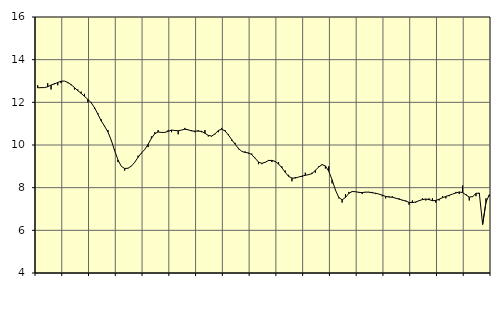
| Category | Piggar | Tillverkning av verkstadsvaror, SNI 25-30, 33 |
|---|---|---|
| nan | 12.8 | 12.68 |
| 87.0 | 12.7 | 12.69 |
| 87.0 | 12.7 | 12.69 |
| 87.0 | 12.9 | 12.73 |
| nan | 12.6 | 12.81 |
| 88.0 | 12.9 | 12.86 |
| 88.0 | 12.8 | 12.93 |
| 88.0 | 12.9 | 12.99 |
| nan | 13 | 13 |
| 89.0 | 12.9 | 12.93 |
| 89.0 | 12.8 | 12.83 |
| 89.0 | 12.6 | 12.69 |
| nan | 12.6 | 12.55 |
| 90.0 | 12.5 | 12.42 |
| 90.0 | 12.4 | 12.28 |
| 90.0 | 12 | 12.14 |
| nan | 12 | 11.98 |
| 91.0 | 11.7 | 11.75 |
| 91.0 | 11.5 | 11.44 |
| 91.0 | 11.2 | 11.13 |
| nan | 10.9 | 10.88 |
| 92.0 | 10.7 | 10.61 |
| 92.0 | 10.2 | 10.22 |
| 92.0 | 9.8 | 9.74 |
| nan | 9.2 | 9.3 |
| 93.0 | 9 | 9 |
| 93.0 | 8.8 | 8.9 |
| 93.0 | 8.9 | 8.91 |
| nan | 9 | 9.01 |
| 94.0 | 9.2 | 9.19 |
| 94.0 | 9.5 | 9.42 |
| 94.0 | 9.6 | 9.62 |
| nan | 9.8 | 9.79 |
| 95.0 | 9.9 | 10.03 |
| 95.0 | 10.4 | 10.31 |
| 95.0 | 10.6 | 10.53 |
| nan | 10.7 | 10.61 |
| 96.0 | 10.6 | 10.59 |
| 96.0 | 10.6 | 10.59 |
| 96.0 | 10.7 | 10.64 |
| nan | 10.6 | 10.7 |
| 97.0 | 10.7 | 10.68 |
| 97.0 | 10.5 | 10.67 |
| 97.0 | 10.7 | 10.7 |
| nan | 10.8 | 10.74 |
| 98.0 | 10.7 | 10.71 |
| 98.0 | 10.7 | 10.66 |
| 98.0 | 10.6 | 10.65 |
| nan | 10.7 | 10.65 |
| 99.0 | 10.6 | 10.64 |
| 99.0 | 10.7 | 10.55 |
| 99.0 | 10.4 | 10.45 |
| nan | 10.4 | 10.42 |
| 0.0 | 10.5 | 10.52 |
| 0.0 | 10.6 | 10.68 |
| 0.0 | 10.8 | 10.74 |
| nan | 10.7 | 10.66 |
| 1.0 | 10.5 | 10.47 |
| 1.0 | 10.2 | 10.25 |
| 1.0 | 10.1 | 10.04 |
| nan | 9.8 | 9.84 |
| 2.0 | 9.7 | 9.7 |
| 2.0 | 9.7 | 9.65 |
| 2.0 | 9.6 | 9.63 |
| nan | 9.6 | 9.55 |
| 3.0 | 9.4 | 9.38 |
| 3.0 | 9.1 | 9.2 |
| 3.0 | 9.1 | 9.14 |
| nan | 9.2 | 9.19 |
| 4.0 | 9.3 | 9.27 |
| 4.0 | 9.2 | 9.28 |
| 4.0 | 9.2 | 9.23 |
| nan | 9.2 | 9.11 |
| 5.0 | 9 | 8.93 |
| 5.0 | 8.8 | 8.72 |
| 5.0 | 8.6 | 8.53 |
| nan | 8.3 | 8.45 |
| 6.0 | 8.5 | 8.45 |
| 6.0 | 8.5 | 8.5 |
| 6.0 | 8.5 | 8.54 |
| nan | 8.7 | 8.58 |
| 7.0 | 8.6 | 8.61 |
| 7.0 | 8.7 | 8.66 |
| 7.0 | 8.7 | 8.81 |
| nan | 9 | 8.97 |
| 8.0 | 9.1 | 9.08 |
| 8.0 | 8.9 | 9.02 |
| 8.0 | 9 | 8.77 |
| nan | 8.2 | 8.37 |
| 9.0 | 7.9 | 7.89 |
| 9.0 | 7.5 | 7.54 |
| 9.0 | 7.3 | 7.43 |
| nan | 7.7 | 7.54 |
| 10.0 | 7.8 | 7.73 |
| 10.0 | 7.8 | 7.82 |
| 10.0 | 7.8 | 7.81 |
| nan | 7.8 | 7.78 |
| 11.0 | 7.7 | 7.77 |
| 11.0 | 7.8 | 7.79 |
| 11.0 | 7.8 | 7.79 |
| nan | 7.8 | 7.76 |
| 12.0 | 7.7 | 7.74 |
| 12.0 | 7.7 | 7.7 |
| 12.0 | 7.6 | 7.65 |
| nan | 7.5 | 7.59 |
| 13.0 | 7.6 | 7.56 |
| 13.0 | 7.6 | 7.55 |
| 13.0 | 7.5 | 7.51 |
| nan | 7.5 | 7.46 |
| 14.0 | 7.4 | 7.42 |
| 14.0 | 7.4 | 7.37 |
| 14.0 | 7.2 | 7.31 |
| nan | 7.4 | 7.3 |
| 15.0 | 7.3 | 7.33 |
| 15.0 | 7.4 | 7.39 |
| 15.0 | 7.5 | 7.44 |
| nan | 7.4 | 7.47 |
| 16.0 | 7.5 | 7.44 |
| 16.0 | 7.5 | 7.39 |
| 16.0 | 7.3 | 7.4 |
| nan | 7.4 | 7.46 |
| 17.0 | 7.6 | 7.53 |
| 17.0 | 7.5 | 7.59 |
| 17.0 | 7.6 | 7.64 |
| nan | 7.7 | 7.7 |
| 18.0 | 7.8 | 7.75 |
| 18.0 | 7.7 | 7.8 |
| 18.0 | 8.1 | 7.77 |
| nan | 7.7 | 7.66 |
| 19.0 | 7.4 | 7.56 |
| 19.0 | 7.6 | 7.58 |
| 19.0 | 7.6 | 7.73 |
| nan | 7.7 | 7.75 |
| 20.0 | 6.3 | 6.28 |
| 20.0 | 7.5 | 7.32 |
| 20.0 | 7.6 | 7.67 |